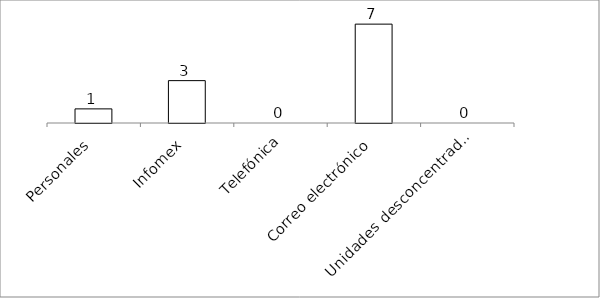
| Category | Series 0 |
|---|---|
| Personales | 1 |
| Infomex | 3 |
| Telefónica | 0 |
| Correo electrónico | 7 |
| Unidades desconcentradas | 0 |